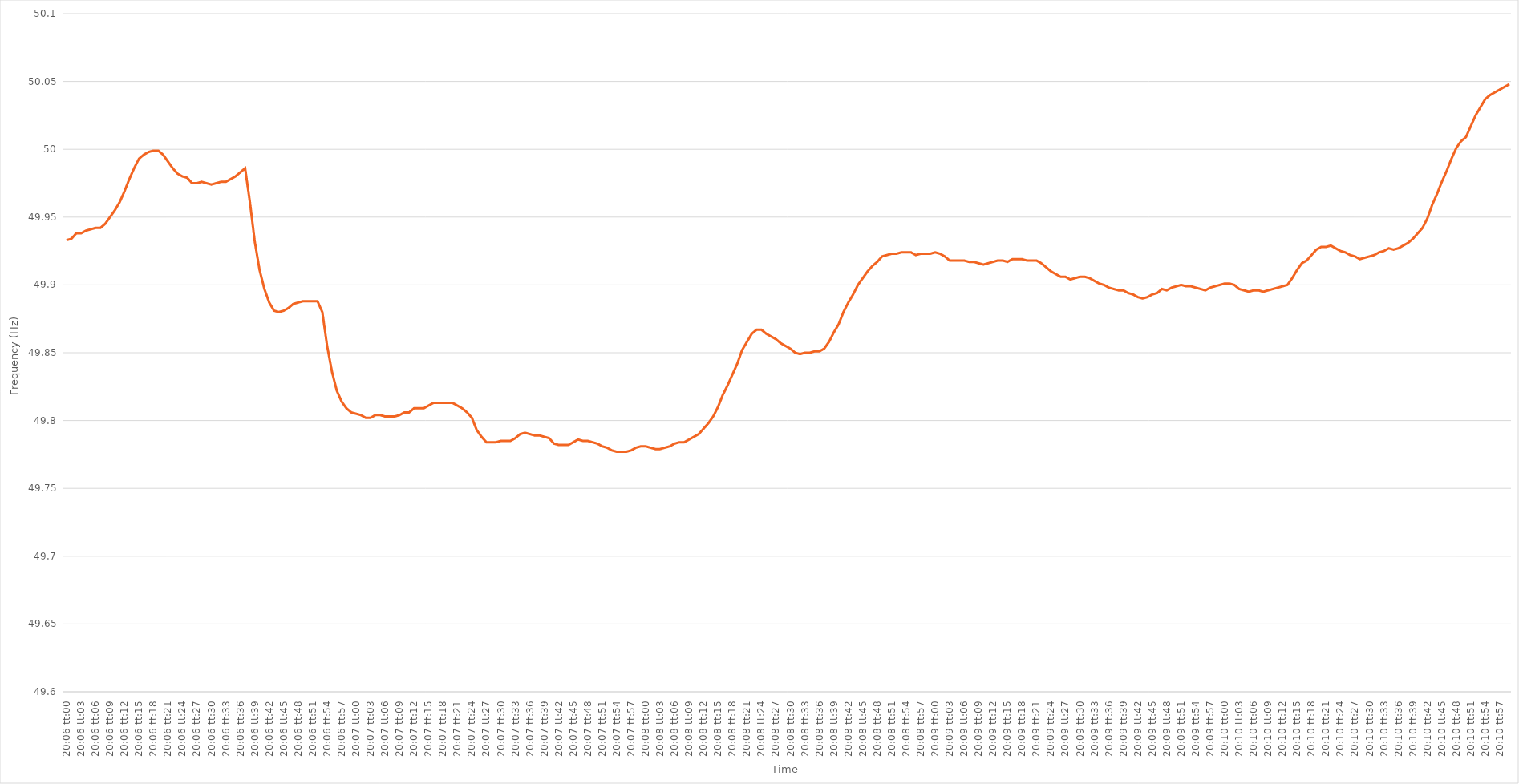
| Category | Series 0 |
|---|---|
| 0.8375 | 49.933 |
| 0.8375115740740741 | 49.934 |
| 0.8375231481481481 | 49.938 |
| 0.8375347222222222 | 49.938 |
| 0.8375462962962964 | 49.94 |
| 0.8375578703703703 | 49.941 |
| 0.8375694444444445 | 49.942 |
| 0.8375810185185185 | 49.942 |
| 0.8375925925925927 | 49.945 |
| 0.8376041666666666 | 49.95 |
| 0.8376157407407407 | 49.955 |
| 0.8376273148148149 | 49.961 |
| 0.8376388888888888 | 49.969 |
| 0.837650462962963 | 49.978 |
| 0.837662037037037 | 49.986 |
| 0.8376736111111112 | 49.993 |
| 0.8376851851851851 | 49.996 |
| 0.8376967592592592 | 49.998 |
| 0.8377083333333334 | 49.999 |
| 0.8377199074074074 | 49.999 |
| 0.8377314814814815 | 49.996 |
| 0.8377430555555555 | 49.991 |
| 0.8377546296296297 | 49.986 |
| 0.8377662037037038 | 49.982 |
| 0.8377777777777777 | 49.98 |
| 0.8377893518518519 | 49.979 |
| 0.8378009259259259 | 49.975 |
| 0.8378125000000001 | 49.975 |
| 0.837824074074074 | 49.976 |
| 0.8378356481481481 | 49.975 |
| 0.8378472222222223 | 49.974 |
| 0.8378587962962962 | 49.975 |
| 0.8378703703703704 | 49.976 |
| 0.8378819444444444 | 49.976 |
| 0.8378935185185186 | 49.978 |
| 0.8379050925925925 | 49.98 |
| 0.8379166666666666 | 49.983 |
| 0.8379282407407408 | 49.986 |
| 0.8379398148148148 | 49.961 |
| 0.8379513888888889 | 49.932 |
| 0.8379629629629629 | 49.911 |
| 0.8379745370370371 | 49.897 |
| 0.8379861111111112 | 49.887 |
| 0.8379976851851851 | 49.881 |
| 0.8380092592592593 | 49.88 |
| 0.8380208333333333 | 49.881 |
| 0.8380324074074075 | 49.883 |
| 0.8380439814814814 | 49.886 |
| 0.8380555555555556 | 49.887 |
| 0.8380671296296297 | 49.888 |
| 0.8380787037037036 | 49.888 |
| 0.8380902777777778 | 49.888 |
| 0.8381018518518518 | 49.888 |
| 0.838113425925926 | 49.88 |
| 0.8381249999999999 | 49.855 |
| 0.838136574074074 | 49.836 |
| 0.8381481481481482 | 49.822 |
| 0.8381597222222222 | 49.814 |
| 0.8381712962962963 | 49.809 |
| 0.8381828703703703 | 49.806 |
| 0.8381944444444445 | 49.805 |
| 0.8382060185185186 | 49.804 |
| 0.8382175925925925 | 49.802 |
| 0.8382291666666667 | 49.802 |
| 0.8382407407407407 | 49.804 |
| 0.8382523148148149 | 49.804 |
| 0.8382638888888888 | 49.803 |
| 0.838275462962963 | 49.803 |
| 0.8382870370370371 | 49.803 |
| 0.8382986111111111 | 49.804 |
| 0.8383101851851852 | 49.806 |
| 0.8383217592592592 | 49.806 |
| 0.8383333333333334 | 49.809 |
| 0.8383449074074073 | 49.809 |
| 0.8383564814814815 | 49.809 |
| 0.8383680555555556 | 49.811 |
| 0.8383796296296296 | 49.813 |
| 0.8383912037037037 | 49.813 |
| 0.8384027777777777 | 49.813 |
| 0.8384143518518519 | 49.813 |
| 0.838425925925926 | 49.813 |
| 0.8384375 | 49.811 |
| 0.8384490740740741 | 49.809 |
| 0.8384606481481481 | 49.806 |
| 0.8384722222222223 | 49.802 |
| 0.8384837962962962 | 49.793 |
| 0.8384953703703704 | 49.788 |
| 0.8385069444444445 | 49.784 |
| 0.8385185185185186 | 49.784 |
| 0.8385300925925926 | 49.784 |
| 0.8385416666666666 | 49.785 |
| 0.8385532407407408 | 49.785 |
| 0.8385648148148147 | 49.785 |
| 0.8385763888888889 | 49.787 |
| 0.838587962962963 | 49.79 |
| 0.838599537037037 | 49.791 |
| 0.8386111111111111 | 49.79 |
| 0.8386226851851851 | 49.789 |
| 0.8386342592592593 | 49.789 |
| 0.8386458333333334 | 49.788 |
| 0.8386574074074074 | 49.787 |
| 0.8386689814814815 | 49.783 |
| 0.8386805555555555 | 49.782 |
| 0.8386921296296297 | 49.782 |
| 0.8387037037037036 | 49.782 |
| 0.8387152777777778 | 49.784 |
| 0.8387268518518519 | 49.786 |
| 0.838738425925926 | 49.785 |
| 0.83875 | 49.785 |
| 0.838761574074074 | 49.784 |
| 0.8387731481481482 | 49.783 |
| 0.8387847222222221 | 49.781 |
| 0.8387962962962963 | 49.78 |
| 0.8388078703703704 | 49.778 |
| 0.8388194444444445 | 49.777 |
| 0.8388310185185185 | 49.777 |
| 0.8388425925925925 | 49.777 |
| 0.8388541666666667 | 49.778 |
| 0.8388657407407408 | 49.78 |
| 0.8388773148148148 | 49.781 |
| 0.8388888888888889 | 49.781 |
| 0.838900462962963 | 49.78 |
| 0.8389120370370371 | 49.779 |
| 0.838923611111111 | 49.779 |
| 0.8389351851851852 | 49.78 |
| 0.8389467592592593 | 49.781 |
| 0.8389583333333334 | 49.783 |
| 0.8389699074074074 | 49.784 |
| 0.8389814814814814 | 49.784 |
| 0.8389930555555556 | 49.786 |
| 0.8390046296296297 | 49.788 |
| 0.8390162037037037 | 49.79 |
| 0.8390277777777778 | 49.794 |
| 0.8390393518518519 | 49.798 |
| 0.8390509259259259 | 49.803 |
| 0.8390624999999999 | 49.81 |
| 0.8390740740740741 | 49.819 |
| 0.8390856481481482 | 49.826 |
| 0.8390972222222222 | 49.834 |
| 0.8391087962962963 | 49.842 |
| 0.8391203703703703 | 49.852 |
| 0.8391319444444445 | 49.858 |
| 0.8391435185185184 | 49.864 |
| 0.8391550925925926 | 49.867 |
| 0.8391666666666667 | 49.867 |
| 0.8391782407407408 | 49.864 |
| 0.8391898148148148 | 49.862 |
| 0.8392013888888888 | 49.86 |
| 0.839212962962963 | 49.857 |
| 0.8392245370370371 | 49.855 |
| 0.8392361111111111 | 49.853 |
| 0.8392476851851852 | 49.85 |
| 0.8392592592592593 | 49.849 |
| 0.8392708333333333 | 49.85 |
| 0.8392824074074073 | 49.85 |
| 0.8392939814814815 | 49.851 |
| 0.8393055555555556 | 49.851 |
| 0.8393171296296296 | 49.853 |
| 0.8393287037037037 | 49.858 |
| 0.8393402777777778 | 49.865 |
| 0.8393518518518519 | 49.871 |
| 0.8393634259259258 | 49.88 |
| 0.839375 | 49.887 |
| 0.8393865740740741 | 49.893 |
| 0.8393981481481482 | 49.9 |
| 0.8394097222222222 | 49.905 |
| 0.8394212962962962 | 49.91 |
| 0.8394328703703704 | 49.914 |
| 0.8394444444444445 | 49.917 |
| 0.8394560185185185 | 49.921 |
| 0.8394675925925926 | 49.922 |
| 0.8394791666666667 | 49.923 |
| 0.8394907407407407 | 49.923 |
| 0.8395023148148147 | 49.924 |
| 0.8395138888888889 | 49.924 |
| 0.839525462962963 | 49.924 |
| 0.839537037037037 | 49.922 |
| 0.8395486111111111 | 49.923 |
| 0.8395601851851852 | 49.923 |
| 0.8395717592592593 | 49.923 |
| 0.8395833333333332 | 49.924 |
| 0.8395949074074074 | 49.923 |
| 0.8396064814814815 | 49.921 |
| 0.8396180555555556 | 49.918 |
| 0.8396296296296296 | 49.918 |
| 0.8396412037037037 | 49.918 |
| 0.8396527777777778 | 49.918 |
| 0.839664351851852 | 49.917 |
| 0.8396759259259259 | 49.917 |
| 0.8396875 | 49.916 |
| 0.8396990740740741 | 49.915 |
| 0.8397106481481482 | 49.916 |
| 0.8397222222222221 | 49.917 |
| 0.8397337962962963 | 49.918 |
| 0.8397453703703704 | 49.918 |
| 0.8397569444444444 | 49.917 |
| 0.8397685185185185 | 49.919 |
| 0.8397800925925926 | 49.919 |
| 0.8397916666666667 | 49.919 |
| 0.8398032407407406 | 49.918 |
| 0.8398148148148148 | 49.918 |
| 0.8398263888888889 | 49.918 |
| 0.839837962962963 | 49.916 |
| 0.839849537037037 | 49.913 |
| 0.8398611111111111 | 49.91 |
| 0.8398726851851852 | 49.908 |
| 0.8398842592592594 | 49.906 |
| 0.8398958333333333 | 49.906 |
| 0.8399074074074074 | 49.904 |
| 0.8399189814814815 | 49.905 |
| 0.8399305555555556 | 49.906 |
| 0.8399421296296296 | 49.906 |
| 0.8399537037037037 | 49.905 |
| 0.8399652777777779 | 49.903 |
| 0.8399768518518518 | 49.901 |
| 0.8399884259259259 | 49.9 |
| 0.84 | 49.898 |
| 0.8400115740740741 | 49.897 |
| 0.840023148148148 | 49.896 |
| 0.8400347222222222 | 49.896 |
| 0.8400462962962963 | 49.894 |
| 0.8400578703703704 | 49.893 |
| 0.8400694444444444 | 49.891 |
| 0.8400810185185185 | 49.89 |
| 0.8400925925925926 | 49.891 |
| 0.8401041666666668 | 49.893 |
| 0.8401157407407407 | 49.894 |
| 0.8401273148148148 | 49.897 |
| 0.8401388888888889 | 49.896 |
| 0.840150462962963 | 49.898 |
| 0.840162037037037 | 49.899 |
| 0.8401736111111111 | 49.9 |
| 0.8401851851851853 | 49.899 |
| 0.8401967592592593 | 49.899 |
| 0.8402083333333333 | 49.898 |
| 0.8402199074074074 | 49.897 |
| 0.8402314814814815 | 49.896 |
| 0.8402430555555555 | 49.898 |
| 0.8402546296296296 | 49.899 |
| 0.8402662037037038 | 49.9 |
| 0.8402777777777778 | 49.901 |
| 0.8402893518518518 | 49.901 |
| 0.8403009259259259 | 49.9 |
| 0.8403125 | 49.897 |
| 0.8403240740740742 | 49.896 |
| 0.8403356481481481 | 49.895 |
| 0.8403472222222222 | 49.896 |
| 0.8403587962962963 | 49.896 |
| 0.8403703703703704 | 49.895 |
| 0.8403819444444444 | 49.896 |
| 0.8403935185185185 | 49.897 |
| 0.8404050925925927 | 49.898 |
| 0.8404166666666667 | 49.899 |
| 0.8404282407407407 | 49.9 |
| 0.8404398148148148 | 49.905 |
| 0.8404513888888889 | 49.911 |
| 0.8404629629629629 | 49.916 |
| 0.840474537037037 | 49.918 |
| 0.8404861111111112 | 49.922 |
| 0.8404976851851852 | 49.926 |
| 0.8405092592592592 | 49.928 |
| 0.8405208333333333 | 49.928 |
| 0.8405324074074074 | 49.929 |
| 0.8405439814814816 | 49.927 |
| 0.8405555555555555 | 49.925 |
| 0.8405671296296297 | 49.924 |
| 0.8405787037037037 | 49.922 |
| 0.8405902777777778 | 49.921 |
| 0.8406018518518518 | 49.919 |
| 0.8406134259259259 | 49.92 |
| 0.8406250000000001 | 49.921 |
| 0.8406365740740741 | 49.922 |
| 0.8406481481481481 | 49.924 |
| 0.8406597222222222 | 49.925 |
| 0.8406712962962963 | 49.927 |
| 0.8406828703703703 | 49.926 |
| 0.8406944444444444 | 49.927 |
| 0.8407060185185186 | 49.929 |
| 0.8407175925925926 | 49.931 |
| 0.8407291666666666 | 49.934 |
| 0.8407407407407407 | 49.938 |
| 0.8407523148148148 | 49.942 |
| 0.840763888888889 | 49.949 |
| 0.8407754629629629 | 49.959 |
| 0.840787037037037 | 49.967 |
| 0.8407986111111111 | 49.976 |
| 0.8408101851851852 | 49.984 |
| 0.8408217592592592 | 49.993 |
| 0.8408333333333333 | 50.001 |
| 0.8408449074074075 | 50.006 |
| 0.8408564814814815 | 50.009 |
| 0.8408680555555555 | 50.017 |
| 0.8408796296296296 | 50.025 |
| 0.8408912037037037 | 50.031 |
| 0.8409027777777779 | 50.037 |
| 0.8409143518518518 | 50.04 |
| 0.840925925925926 | 50.042 |
| 0.8409375 | 50.044 |
| 0.840949074074074 | 50.046 |
| 0.8409606481481481 | 50.048 |